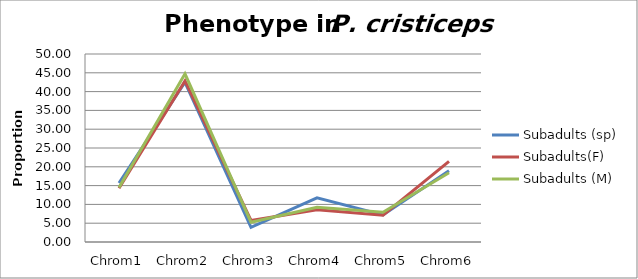
| Category | Subadults (sp) | Subadults(F)  | Subadults (M) |
|---|---|---|---|
| Chrom1 | 15.686 | 14.286 | 14.474 |
| Chrom2 | 42.484 | 42.857 | 44.737 |
| Chrom3 | 3.922 | 5.714 | 5.263 |
| Chrom4 | 11.765 | 8.571 | 9.211 |
| Chrom5 | 7.19 | 7.143 | 7.895 |
| Chrom6 | 18.954 | 21.429 | 18.421 |